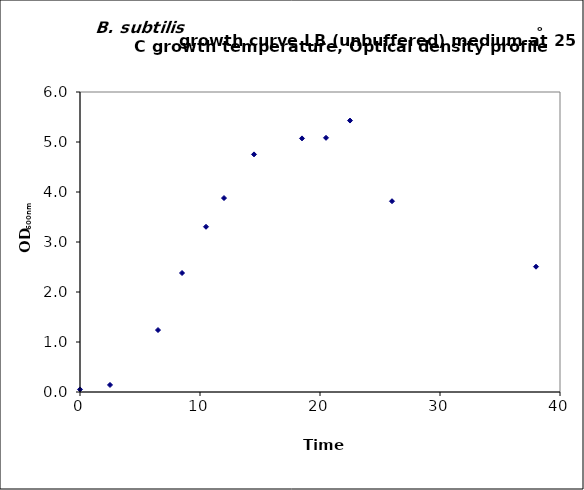
| Category | Series 0 |
|---|---|
| 0.0 | 0.051 |
| 2.5 | 0.141 |
| 6.5 | 1.239 |
| 8.5 | 2.38 |
| 10.5 | 3.305 |
| 12.0 | 3.879 |
| 14.5 | 4.752 |
| 18.5 | 5.072 |
| 20.5 | 5.084 |
| 22.5 | 5.429 |
| 26.0 | 3.816 |
| 38.0 | 2.506 |